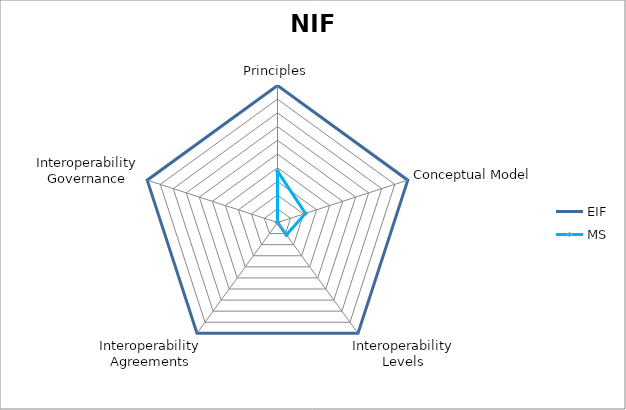
| Category | EIF | MS |
|---|---|---|
| Principles | 1 | 0.375 |
| Conceptual Model | 1 | 0.214 |
| Interoperability Levels | 1 | 0.111 |
| Interoperability Agreements | 1 | 0 |
| Interoperability Governance | 1 | 0 |